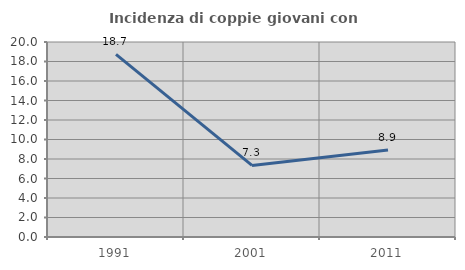
| Category | Incidenza di coppie giovani con figli |
|---|---|
| 1991.0 | 18.737 |
| 2001.0 | 7.343 |
| 2011.0 | 8.917 |